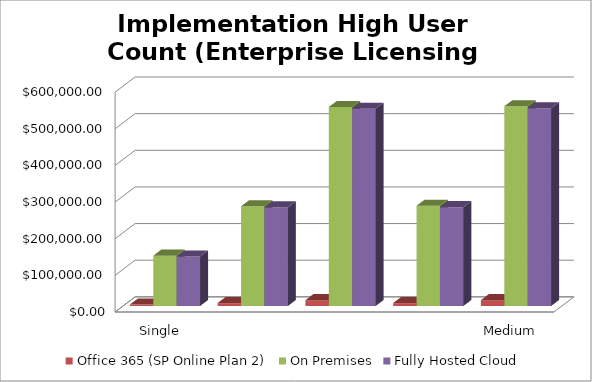
| Category | Office 365 (SP Online Plan 2) | On Premises | Fully Hosted Cloud |
|---|---|---|---|
| Single Server Install (WFE and SQL on 1 VM) | 4000 | 137446.269 | 135170 |
| Small Farm - Two Server Install (WFE and SQL) | 8000 | 272334.608 | 269160 |
| Small Farm w/ High Availability (2 WFE - 2 SQL) | 16000 | 543152.043 | 538325 |
| Medium Farm (1 WFE, 1 App/Index, 1 SQL) | 8000 | 273407.455 | 269860 |
| Medium Farm w/ High Availability (2 WFE, 2 A/I, 2 SQL) | 16000 | 545371.894 | 539915 |